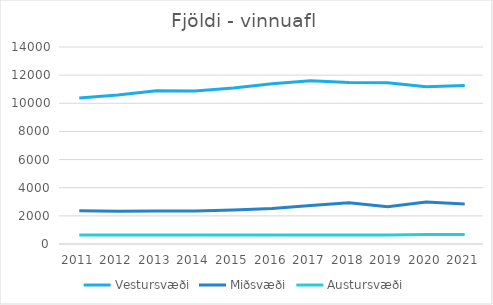
| Category | Vestursvæði | Miðsvæði | Austursvæði |
|---|---|---|---|
| 2011.0 | 10375.667 | 2361.667 | 633.667 |
| 2012.0 | 10597.167 | 2322 | 634.417 |
| 2013.0 | 10884.25 | 2343.333 | 647.167 |
| 2014.0 | 10877.25 | 2350.583 | 638.333 |
| 2015.0 | 11089.5 | 2417.417 | 645.25 |
| 2016.0 | 11381.25 | 2515.333 | 636 |
| 2017.0 | 11602.667 | 2742.917 | 637.667 |
| 2018.0 | 11485 | 2928 | 638 |
| 2019.0 | 11459 | 2647 | 638 |
| 2020.0 | 11183 | 2987 | 666.75 |
| 2021.0 | 11256.667 | 2840 | 682.417 |